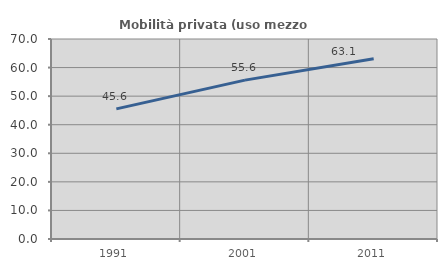
| Category | Mobilità privata (uso mezzo privato) |
|---|---|
| 1991.0 | 45.555 |
| 2001.0 | 55.604 |
| 2011.0 | 63.087 |